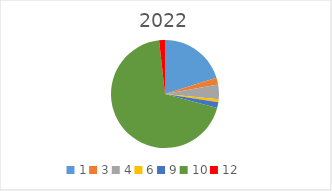
| Category | Series 0 |
|---|---|
| 1.0 | 91800 |
| 3.0 | 9250 |
| 4.0 | 20000 |
| 6.0 | 4000 |
| 9.0 | 8000 |
| 10.0 | 315000 |
| 12.0 | 8000 |